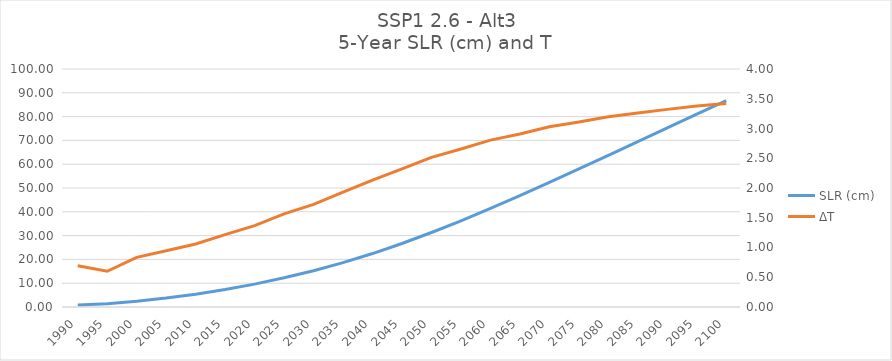
| Category | SLR (cm) |
|---|---|
| 1990.0 | 0.87 |
| 1995.0 | 1.399 |
| 2000.0 | 2.407 |
| 2005.0 | 3.755 |
| 2010.0 | 5.386 |
| 2015.0 | 7.344 |
| 2020.0 | 9.606 |
| 2025.0 | 12.264 |
| 2030.0 | 15.241 |
| 2035.0 | 18.638 |
| 2040.0 | 22.455 |
| 2045.0 | 26.676 |
| 2050.0 | 31.308 |
| 2055.0 | 36.215 |
| 2060.0 | 41.418 |
| 2065.0 | 46.783 |
| 2070.0 | 52.35 |
| 2075.0 | 57.99 |
| 2080.0 | 63.73 |
| 2085.0 | 69.487 |
| 2090.0 | 75.246 |
| 2095.0 | 80.996 |
| 2100.0 | 86.692 |